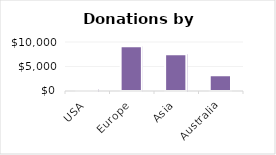
| Category | Donations |
|---|---|
| USA | 400 |
| Europe | 9115 |
| Asia | 7516 |
| Australia | 3208 |